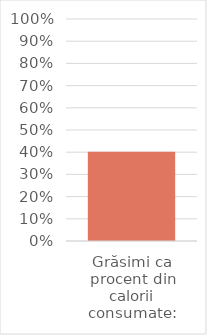
| Category | Series 0 |
|---|---|
| Grăsimi ca procent din calorii consumate: | 0.402 |